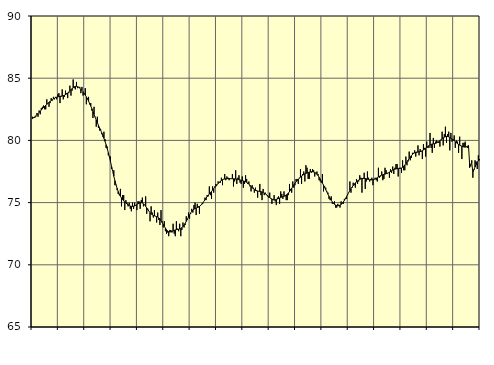
| Category | Piggar | Series 1 |
|---|---|---|
| nan | 81.9 | 81.75 |
| 87.0 | 81.8 | 81.83 |
| 87.0 | 81.8 | 81.89 |
| 87.0 | 81.9 | 81.97 |
| 87.0 | 82.2 | 82.06 |
| 87.0 | 81.9 | 82.15 |
| 87.0 | 82.4 | 82.25 |
| 87.0 | 82.1 | 82.35 |
| 87.0 | 82.6 | 82.45 |
| 87.0 | 82.7 | 82.55 |
| 87.0 | 82.8 | 82.65 |
| 87.0 | 82.5 | 82.74 |
| nan | 82.5 | 82.82 |
| 88.0 | 83.3 | 82.9 |
| 88.0 | 83 | 82.98 |
| 88.0 | 82.7 | 83.06 |
| 88.0 | 83 | 83.13 |
| 88.0 | 83.4 | 83.2 |
| 88.0 | 83.2 | 83.27 |
| 88.0 | 83.5 | 83.34 |
| 88.0 | 83.3 | 83.39 |
| 88.0 | 83.5 | 83.44 |
| 88.0 | 83.3 | 83.47 |
| 88.0 | 83.7 | 83.5 |
| nan | 83.8 | 83.52 |
| 89.0 | 83 | 83.54 |
| 89.0 | 83.5 | 83.56 |
| 89.0 | 84.1 | 83.57 |
| 89.0 | 83.3 | 83.6 |
| 89.0 | 83.5 | 83.63 |
| 89.0 | 84 | 83.68 |
| 89.0 | 83.8 | 83.73 |
| 89.0 | 83.4 | 83.81 |
| 89.0 | 83.8 | 83.89 |
| 89.0 | 84.4 | 83.98 |
| 89.0 | 83.6 | 84.08 |
| nan | 84 | 84.17 |
| 90.0 | 84.9 | 84.25 |
| 90.0 | 84.2 | 84.31 |
| 90.0 | 84.1 | 84.34 |
| 90.0 | 84.7 | 84.35 |
| 90.0 | 84.2 | 84.32 |
| 90.0 | 84.3 | 84.27 |
| 90.0 | 84.3 | 84.2 |
| 90.0 | 83.8 | 84.12 |
| 90.0 | 84.3 | 84.02 |
| 90.0 | 83.6 | 83.91 |
| 90.0 | 83.7 | 83.78 |
| nan | 84.2 | 83.65 |
| 91.0 | 82.9 | 83.5 |
| 91.0 | 83.4 | 83.34 |
| 91.0 | 83.5 | 83.16 |
| 91.0 | 82.9 | 82.97 |
| 91.0 | 83 | 82.77 |
| 91.0 | 82.4 | 82.55 |
| 91.0 | 81.8 | 82.32 |
| 91.0 | 82.7 | 82.09 |
| 91.0 | 81.9 | 81.86 |
| 91.0 | 81.1 | 81.64 |
| 91.0 | 81.9 | 81.42 |
| nan | 81 | 81.22 |
| 92.0 | 80.8 | 81.02 |
| 92.0 | 80.9 | 80.82 |
| 92.0 | 80.5 | 80.61 |
| 92.0 | 80.3 | 80.4 |
| 92.0 | 80.7 | 80.17 |
| 92.0 | 80.1 | 79.92 |
| 92.0 | 79.4 | 79.65 |
| 92.0 | 79.5 | 79.35 |
| 92.0 | 78.8 | 79.02 |
| 92.0 | 78.7 | 78.67 |
| 92.0 | 78.7 | 78.29 |
| nan | 77.7 | 77.89 |
| 93.0 | 77.5 | 77.5 |
| 93.0 | 77.6 | 77.12 |
| 93.0 | 76.4 | 76.77 |
| 93.0 | 76.4 | 76.44 |
| 93.0 | 76 | 76.15 |
| 93.0 | 75.7 | 75.89 |
| 93.0 | 75.6 | 75.68 |
| 93.0 | 76.1 | 75.51 |
| 93.0 | 74.7 | 75.37 |
| 93.0 | 75.6 | 75.25 |
| 93.0 | 75.6 | 75.14 |
| nan | 74.4 | 75.05 |
| 94.0 | 75.2 | 74.97 |
| 94.0 | 75 | 74.89 |
| 94.0 | 74.7 | 74.82 |
| 94.0 | 75 | 74.77 |
| 94.0 | 74.5 | 74.72 |
| 94.0 | 74.3 | 74.7 |
| 94.0 | 75 | 74.7 |
| 94.0 | 74.5 | 74.71 |
| 94.0 | 75 | 74.73 |
| 94.0 | 74.8 | 74.78 |
| 94.0 | 74.4 | 74.83 |
| nan | 75.1 | 74.89 |
| 95.0 | 75.1 | 74.95 |
| 95.0 | 74.5 | 74.99 |
| 95.0 | 75.2 | 75 |
| 95.0 | 75.4 | 74.97 |
| 95.0 | 74.7 | 74.91 |
| 95.0 | 74.8 | 74.82 |
| 95.0 | 75.5 | 74.7 |
| 95.0 | 74.1 | 74.57 |
| 95.0 | 74.5 | 74.44 |
| 95.0 | 74.3 | 74.31 |
| 95.0 | 73.5 | 74.19 |
| nan | 74.7 | 74.1 |
| 96.0 | 74.2 | 74.02 |
| 96.0 | 73.8 | 73.97 |
| 96.0 | 74.4 | 73.94 |
| 96.0 | 73.9 | 73.91 |
| 96.0 | 73.4 | 73.88 |
| 96.0 | 74.2 | 73.84 |
| 96.0 | 73.6 | 73.77 |
| 96.0 | 73.2 | 73.68 |
| 96.0 | 74.4 | 73.55 |
| 96.0 | 73.5 | 73.4 |
| 96.0 | 73 | 73.25 |
| nan | 73.5 | 73.1 |
| 97.0 | 72.7 | 72.95 |
| 97.0 | 72.5 | 72.82 |
| 97.0 | 72.6 | 72.72 |
| 97.0 | 72.3 | 72.66 |
| 97.0 | 72.8 | 72.64 |
| 97.0 | 72.8 | 72.65 |
| 97.0 | 72.6 | 72.68 |
| 97.0 | 73.3 | 72.72 |
| 97.0 | 72.5 | 72.77 |
| 97.0 | 72.3 | 72.8 |
| 97.0 | 73.5 | 72.83 |
| nan | 72.9 | 72.84 |
| 98.0 | 72.7 | 72.86 |
| 98.0 | 73.3 | 72.88 |
| 98.0 | 72.3 | 72.92 |
| 98.0 | 72.8 | 72.99 |
| 98.0 | 73.4 | 73.07 |
| 98.0 | 73 | 73.19 |
| 98.0 | 73.2 | 73.33 |
| 98.0 | 73.9 | 73.49 |
| 98.0 | 73.6 | 73.66 |
| 98.0 | 74.2 | 73.84 |
| 98.0 | 73.7 | 74.01 |
| nan | 74.1 | 74.17 |
| 99.0 | 74.5 | 74.3 |
| 99.0 | 74.2 | 74.4 |
| 99.0 | 74.8 | 74.47 |
| 99.0 | 75 | 74.52 |
| 99.0 | 74 | 74.56 |
| 99.0 | 74.9 | 74.6 |
| 99.0 | 74.7 | 74.63 |
| 99.0 | 74.1 | 74.69 |
| 99.0 | 74.8 | 74.76 |
| 99.0 | 74.9 | 74.85 |
| 99.0 | 74.9 | 74.97 |
| nan | 75.1 | 75.1 |
| 0.0 | 75.4 | 75.23 |
| 0.0 | 75.2 | 75.36 |
| 0.0 | 75.6 | 75.48 |
| 0.0 | 75.5 | 75.59 |
| 0.0 | 76.3 | 75.69 |
| 0.0 | 75.6 | 75.8 |
| 0.0 | 75.3 | 75.9 |
| 0.0 | 76.3 | 76 |
| 0.0 | 75.8 | 76.11 |
| 0.0 | 76.3 | 76.21 |
| 0.0 | 76.5 | 76.32 |
| nan | 76.4 | 76.43 |
| 1.0 | 76.7 | 76.53 |
| 1.0 | 76.6 | 76.63 |
| 1.0 | 76.6 | 76.71 |
| 1.0 | 77 | 76.78 |
| 1.0 | 76.4 | 76.84 |
| 1.0 | 76.9 | 76.88 |
| 1.0 | 77.3 | 76.9 |
| 1.0 | 76.8 | 76.92 |
| 1.0 | 77.1 | 76.93 |
| 1.0 | 77 | 76.93 |
| 1.0 | 76.8 | 76.93 |
| nan | 76.9 | 76.92 |
| 2.0 | 76.9 | 76.92 |
| 2.0 | 77.3 | 76.92 |
| 2.0 | 76.3 | 76.91 |
| 2.0 | 76.7 | 76.91 |
| 2.0 | 77.6 | 76.89 |
| 2.0 | 76.5 | 76.88 |
| 2.0 | 77 | 76.86 |
| 2.0 | 77.2 | 76.84 |
| 2.0 | 76.6 | 76.82 |
| 2.0 | 76.5 | 76.79 |
| 2.0 | 77.1 | 76.77 |
| nan | 76.2 | 76.74 |
| 3.0 | 76.5 | 76.71 |
| 3.0 | 77.2 | 76.67 |
| 3.0 | 76.9 | 76.63 |
| 3.0 | 76.5 | 76.57 |
| 3.0 | 76.7 | 76.49 |
| 3.0 | 76.3 | 76.4 |
| 3.0 | 75.9 | 76.3 |
| 3.0 | 76.4 | 76.2 |
| 3.0 | 76.2 | 76.11 |
| 3.0 | 75.8 | 76.04 |
| 3.0 | 76.2 | 75.98 |
| nan | 76 | 75.95 |
| 4.0 | 75.4 | 75.93 |
| 4.0 | 75.9 | 75.91 |
| 4.0 | 76.5 | 75.9 |
| 4.0 | 75.6 | 75.88 |
| 4.0 | 75.2 | 75.85 |
| 4.0 | 76.1 | 75.82 |
| 4.0 | 75.6 | 75.77 |
| 4.0 | 75.8 | 75.71 |
| 4.0 | 75.6 | 75.64 |
| 4.0 | 75.5 | 75.57 |
| 4.0 | 75.4 | 75.49 |
| nan | 75.8 | 75.41 |
| 5.0 | 75.3 | 75.34 |
| 5.0 | 74.9 | 75.28 |
| 5.0 | 75.2 | 75.24 |
| 5.0 | 75.6 | 75.22 |
| 5.0 | 75.1 | 75.23 |
| 5.0 | 74.8 | 75.25 |
| 5.0 | 75.4 | 75.29 |
| 5.0 | 75.5 | 75.33 |
| 5.0 | 74.9 | 75.37 |
| 5.0 | 75.9 | 75.41 |
| 5.0 | 75.7 | 75.45 |
| nan | 75.3 | 75.48 |
| 6.0 | 75.9 | 75.52 |
| 6.0 | 75.5 | 75.56 |
| 6.0 | 75.2 | 75.61 |
| 6.0 | 75.2 | 75.68 |
| 6.0 | 75.6 | 75.77 |
| 6.0 | 76.5 | 75.88 |
| 6.0 | 76.1 | 76 |
| 6.0 | 75.8 | 76.14 |
| 6.0 | 76.7 | 76.28 |
| 6.0 | 76.2 | 76.43 |
| 6.0 | 76.4 | 76.55 |
| nan | 76.9 | 76.67 |
| 7.0 | 76.9 | 76.77 |
| 7.0 | 76.5 | 76.87 |
| 7.0 | 77 | 76.96 |
| 7.0 | 77.7 | 77.05 |
| 7.0 | 76.5 | 77.13 |
| 7.0 | 77.3 | 77.2 |
| 7.0 | 77.5 | 77.26 |
| 7.0 | 76.7 | 77.31 |
| 7.0 | 78 | 77.35 |
| 7.0 | 77.8 | 77.38 |
| 7.0 | 76.9 | 77.42 |
| nan | 76.9 | 77.45 |
| 8.0 | 77.7 | 77.47 |
| 8.0 | 77.4 | 77.48 |
| 8.0 | 77.7 | 77.48 |
| 8.0 | 77.6 | 77.46 |
| 8.0 | 77.1 | 77.42 |
| 8.0 | 77.4 | 77.36 |
| 8.0 | 77.5 | 77.27 |
| 8.0 | 77.3 | 77.17 |
| 8.0 | 76.8 | 77.04 |
| 8.0 | 76.7 | 76.9 |
| 8.0 | 76.6 | 76.74 |
| nan | 77.3 | 76.57 |
| 9.0 | 75.9 | 76.4 |
| 9.0 | 76.3 | 76.22 |
| 9.0 | 76.2 | 76.04 |
| 9.0 | 75.9 | 75.86 |
| 9.0 | 75.8 | 75.68 |
| 9.0 | 75.3 | 75.51 |
| 9.0 | 75.2 | 75.34 |
| 9.0 | 75.5 | 75.19 |
| 9.0 | 74.9 | 75.06 |
| 9.0 | 75 | 74.95 |
| 9.0 | 75.1 | 74.86 |
| nan | 74.6 | 74.8 |
| 10.0 | 74.6 | 74.76 |
| 10.0 | 74.9 | 74.75 |
| 10.0 | 74.8 | 74.76 |
| 10.0 | 74.6 | 74.79 |
| 10.0 | 75.1 | 74.85 |
| 10.0 | 74.9 | 74.93 |
| 10.0 | 74.9 | 75.05 |
| 10.0 | 75.3 | 75.18 |
| 10.0 | 75.3 | 75.33 |
| 10.0 | 75.3 | 75.49 |
| 10.0 | 75.6 | 75.66 |
| nan | 75.8 | 75.82 |
| 11.0 | 76.7 | 75.97 |
| 11.0 | 75.8 | 76.12 |
| 11.0 | 76.2 | 76.25 |
| 11.0 | 76.6 | 76.37 |
| 11.0 | 76.4 | 76.48 |
| 11.0 | 76.2 | 76.58 |
| 11.0 | 76.9 | 76.67 |
| 11.0 | 76.5 | 76.75 |
| 11.0 | 76.7 | 76.81 |
| 11.0 | 77.2 | 76.86 |
| 11.0 | 77 | 76.91 |
| nan | 75.8 | 76.93 |
| 12.0 | 76.9 | 76.95 |
| 12.0 | 77.4 | 76.94 |
| 12.0 | 76.1 | 76.93 |
| 12.0 | 76.7 | 76.91 |
| 12.0 | 77.5 | 76.88 |
| 12.0 | 77 | 76.86 |
| 12.0 | 76.7 | 76.83 |
| 12.0 | 76.9 | 76.82 |
| 12.0 | 77 | 76.83 |
| 12.0 | 76.4 | 76.85 |
| 12.0 | 76.9 | 76.87 |
| nan | 77 | 76.91 |
| 13.0 | 76.8 | 76.95 |
| 13.0 | 76.7 | 77 |
| 13.0 | 77.8 | 77.06 |
| 13.0 | 77 | 77.11 |
| 13.0 | 77.1 | 77.17 |
| 13.0 | 77.5 | 77.21 |
| 13.0 | 76.8 | 77.24 |
| 13.0 | 76.9 | 77.27 |
| 13.0 | 77.8 | 77.29 |
| 13.0 | 77.6 | 77.32 |
| 13.0 | 77.3 | 77.35 |
| nan | 77.4 | 77.39 |
| 14.0 | 77 | 77.45 |
| 14.0 | 77.7 | 77.5 |
| 14.0 | 77.4 | 77.56 |
| 14.0 | 77.9 | 77.61 |
| 14.0 | 77.3 | 77.65 |
| 14.0 | 77.8 | 77.69 |
| 14.0 | 78.1 | 77.71 |
| 14.0 | 78.1 | 77.72 |
| 14.0 | 77.1 | 77.73 |
| 14.0 | 77.8 | 77.74 |
| 14.0 | 77.8 | 77.75 |
| nan | 77.4 | 77.78 |
| 15.0 | 78.4 | 77.84 |
| 15.0 | 77.6 | 77.92 |
| 15.0 | 77.6 | 78.02 |
| 15.0 | 78.7 | 78.14 |
| 15.0 | 78 | 78.27 |
| 15.0 | 78.3 | 78.41 |
| 15.0 | 79.1 | 78.54 |
| 15.0 | 78.4 | 78.66 |
| 15.0 | 78.6 | 78.78 |
| 15.0 | 79 | 78.87 |
| 15.0 | 79 | 78.95 |
| nan | 79.2 | 79 |
| 16.0 | 78.7 | 79.04 |
| 16.0 | 79 | 79.06 |
| 16.0 | 79.6 | 79.08 |
| 16.0 | 78.8 | 79.09 |
| 16.0 | 79.3 | 79.1 |
| 16.0 | 79.1 | 79.13 |
| 16.0 | 78.5 | 79.17 |
| 16.0 | 79.7 | 79.23 |
| 16.0 | 79.4 | 79.29 |
| 16.0 | 78.7 | 79.37 |
| 16.0 | 79.9 | 79.44 |
| nan | 79.4 | 79.51 |
| 17.0 | 79.4 | 79.58 |
| 17.0 | 80.6 | 79.63 |
| 17.0 | 79.4 | 79.68 |
| 17.0 | 79 | 79.71 |
| 17.0 | 80.2 | 79.72 |
| 17.0 | 79.4 | 79.74 |
| 17.0 | 79.9 | 79.76 |
| 17.0 | 80 | 79.79 |
| 17.0 | 79.9 | 79.84 |
| 17.0 | 79.8 | 79.9 |
| 17.0 | 79.5 | 79.98 |
| nan | 80 | 80.07 |
| 18.0 | 80.7 | 80.14 |
| 18.0 | 79.6 | 80.21 |
| 18.0 | 80.5 | 80.26 |
| 18.0 | 81.1 | 80.3 |
| 18.0 | 79.8 | 80.32 |
| 18.0 | 80.5 | 80.31 |
| 18.0 | 80.7 | 80.29 |
| 18.0 | 79.2 | 80.24 |
| 18.0 | 80.6 | 80.18 |
| 18.0 | 79.9 | 80.12 |
| 18.0 | 80.1 | 80.05 |
| nan | 80.4 | 79.97 |
| 19.0 | 79.4 | 79.89 |
| 19.0 | 80 | 79.81 |
| 19.0 | 79.9 | 79.74 |
| 19.0 | 79 | 79.68 |
| 19.0 | 80.3 | 79.62 |
| 19.0 | 79.6 | 79.56 |
| 19.0 | 78.5 | 79.52 |
| 19.0 | 79.8 | 79.49 |
| 19.0 | 79.8 | 79.47 |
| 19.0 | 79.9 | 79.46 |
| 19.0 | 79.5 | 79.48 |
| nan | 79.4 | 79.52 |
| 20.0 | 79.4 | 79.59 |
| 20.0 | 77.8 | 78.17 |
| 20.0 | 77.9 | 78 |
| 20.0 | 78.4 | 78.17 |
| 20.0 | 77 | 77.45 |
| 20.0 | 77.7 | 77.66 |
| 20.0 | 78.4 | 77.86 |
| 20.0 | 78.3 | 78.06 |
| 20.0 | 77.7 | 78.24 |
| 20.0 | 78.8 | 78.38 |
| 20.0 | 78.4 | 78.49 |